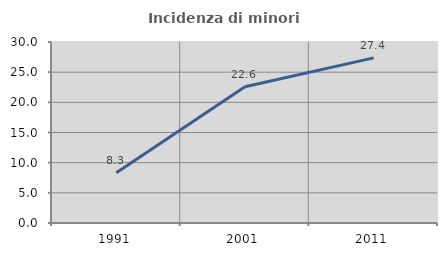
| Category | Incidenza di minori stranieri |
|---|---|
| 1991.0 | 8.333 |
| 2001.0 | 22.581 |
| 2011.0 | 27.365 |